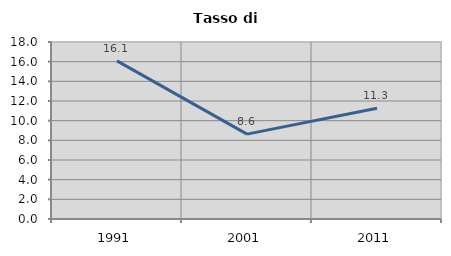
| Category | Tasso di disoccupazione   |
|---|---|
| 1991.0 | 16.08 |
| 2001.0 | 8.632 |
| 2011.0 | 11.255 |